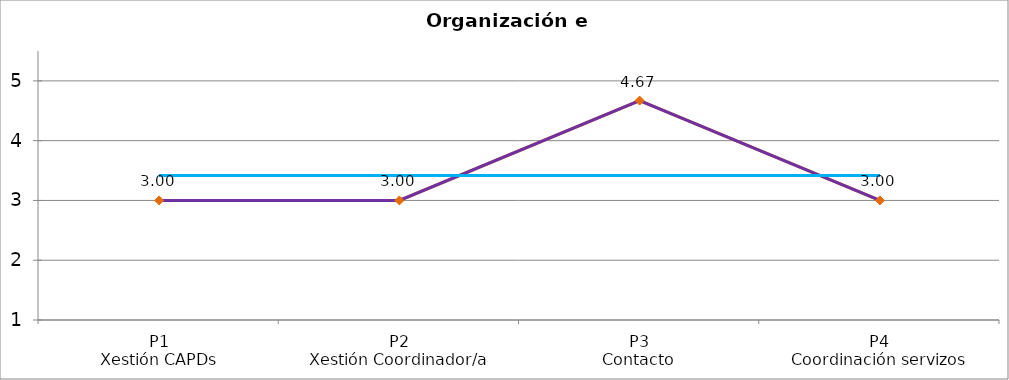
| Category | Valoración (1-5) | MEDIA |
|---|---|---|
| P1
Xestión CAPDs | 3 | 3.418 |
| P2
Xestión Coordinador/a | 3 | 3.418 |
| P3
Contacto | 4.67 | 3.418 |
| P4
Coordinación servizos | 3 | 3.418 |